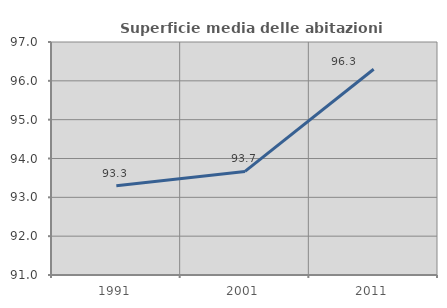
| Category | Superficie media delle abitazioni occupate |
|---|---|
| 1991.0 | 93.297 |
| 2001.0 | 93.667 |
| 2011.0 | 96.298 |